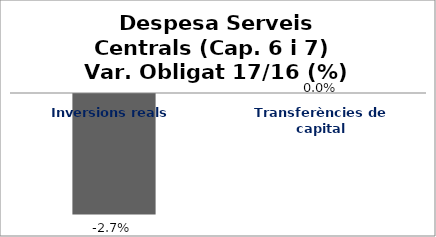
| Category | Series 0 |
|---|---|
| Inversions reals | -0.027 |
| Transferències de capital | 0 |